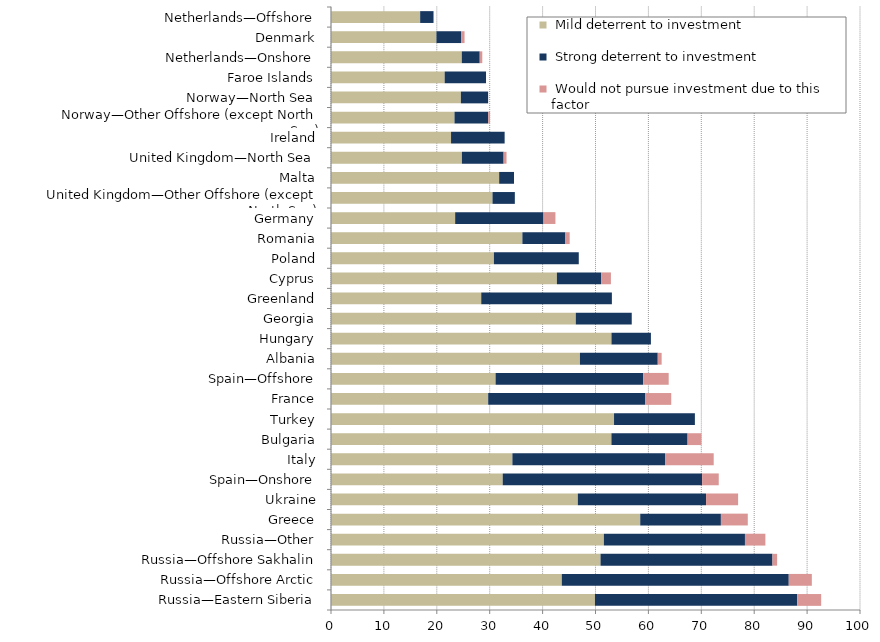
| Category |  Mild deterrent to investment |  Strong deterrent to investment |  Would not pursue investment due to this factor |
|---|---|---|---|
| Russia—Eastern Siberia | 49.894 | 38.23 | 4.536 |
| Russia—Offshore Arctic | 43.63 | 42.903 | 4.363 |
| Russia—Offshore Sakhalin | 50.95 | 32.503 | 0.878 |
| Russia—Other | 51.584 | 26.669 | 3.86 |
| Greece | 58.456 | 15.249 | 5.083 |
| Ukraine | 46.66 | 24.239 | 6.06 |
| Spain—Onshore | 32.461 | 37.696 | 3.141 |
| Italy | 34.291 | 28.854 | 9.2 |
| Bulgaria | 53.01 | 14.398 | 2.618 |
| Turkey | 53.503 | 15.286 | 0 |
| France | 29.714 | 29.714 | 4.89 |
| Spain—Offshore | 31.113 | 27.895 | 4.828 |
| Albania | 47.062 | 14.707 | 0.735 |
| Hungary | 53.019 | 7.456 | 0 |
| Georgia | 46.274 | 10.577 | 0 |
| Greenland | 28.401 | 24.696 | 0 |
| Cyprus | 42.702 | 8.355 | 1.857 |
| Poland | 30.798 | 16.04 | 0 |
| Romania | 36.178 | 8.13 | 0.813 |
| Germany | 23.47 | 16.7 | 2.257 |
| United Kingdom—Other Offshore (except North Sea) | 30.53 | 4.222 | 0 |
| Malta | 31.788 | 2.805 | 0 |
| United Kingdom—North Sea | 24.748 | 7.883 | 0.55 |
| Ireland | 22.693 | 10.131 | 0 |
| Norway—Other Offshore (except North Sea) | 23.348 | 6.368 | 0.354 |
| Norway—North Sea | 24.554 | 5.148 | 0 |
| Faroe Islands | 21.489 | 7.814 | 0 |
| Netherlands—Onshore | 24.724 | 3.393 | 0.485 |
| Denmark | 19.932 | 4.651 | 0.664 |
| Netherlands—Offshore | 16.853 | 2.528 | 0 |